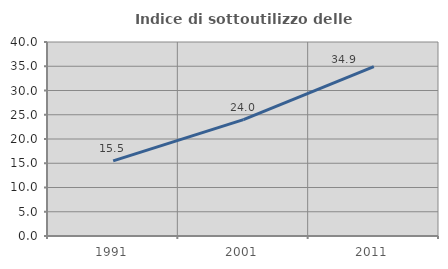
| Category | Indice di sottoutilizzo delle abitazioni  |
|---|---|
| 1991.0 | 15.478 |
| 2001.0 | 23.99 |
| 2011.0 | 34.905 |